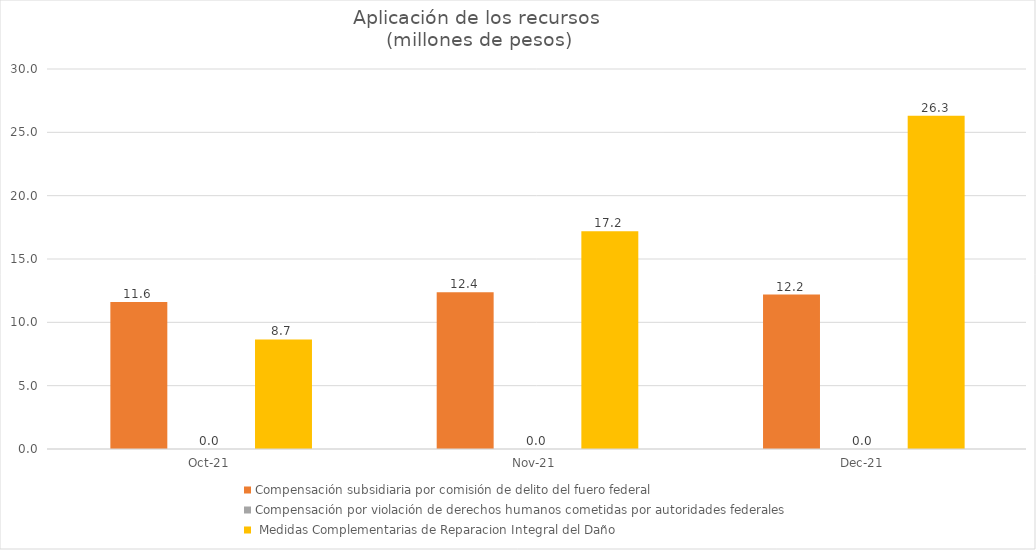
| Category | Medidas de Recursos de Ayuda, por concepto de gastos funerarios, de alimentación, de alojamiento, peritajes, gastos médicos y traslados | Compensación subsidiaria por comisión de delito del fuero federal | Compensación por violación de derechos humanos cometidas por autoridades federales |  Medidas Complementarias de Reparacion Integral del Daño |
|---|---|---|---|---|
| 2021-10-01 |  | 11.608 | 0 | 8.654 |
| 2021-11-01 |  | 12.377 | 0 | 17.183 |
| 2021-12-01 |  | 12.191 | 0 | 26.316 |